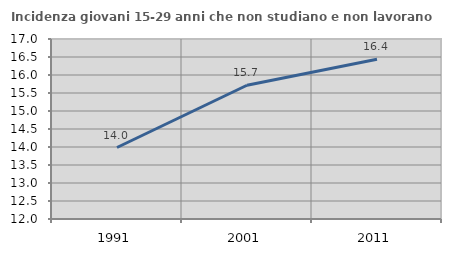
| Category | Incidenza giovani 15-29 anni che non studiano e non lavorano  |
|---|---|
| 1991.0 | 13.986 |
| 2001.0 | 15.716 |
| 2011.0 | 16.439 |